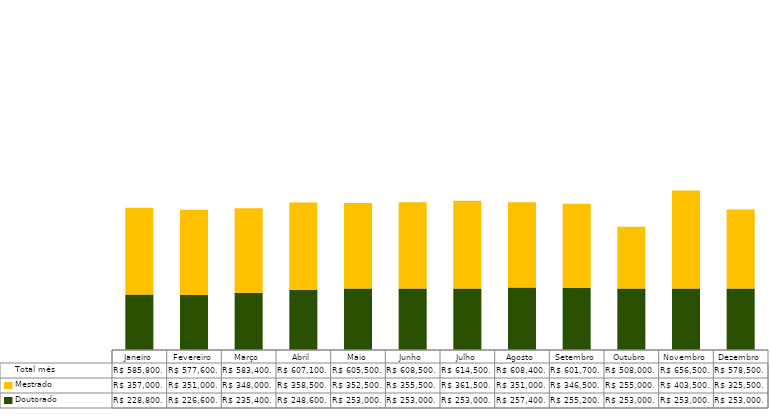
| Category | Doutorado                      | Mestrado                       | Total mês |
|---|---|---|---|
| Janeiro | 228800 | 357000 | 585800 |
| Fevereiro | 226600 | 351000 | 577600 |
| Março | 235400 | 348000 | 583400 |
| Abril | 248600 | 358500 | 607100 |
| Maio | 253000 | 352500 | 605500 |
| Junho | 253000 | 355500 | 608500 |
| Julho | 253000 | 361500 | 614500 |
| Agosto | 257400 | 351000 | 608400 |
| Setembro | 255200 | 346500 | 601700 |
| Outubro | 253000 | 255000 | 508000 |
| Novembro | 253000 | 403500 | 656500 |
| Dezembro | 253000 | 325500 | 578500 |